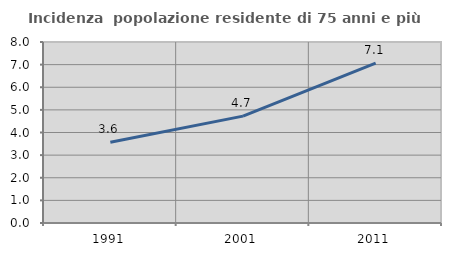
| Category | Incidenza  popolazione residente di 75 anni e più |
|---|---|
| 1991.0 | 3.573 |
| 2001.0 | 4.723 |
| 2011.0 | 7.067 |